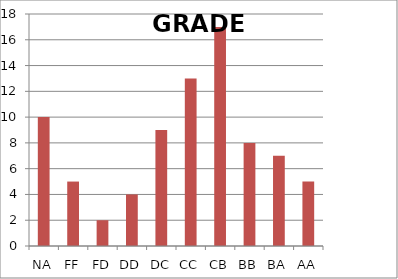
| Category | GRADE |
|---|---|
| NA | 10 |
| FF | 5 |
| FD | 2 |
| DD | 4 |
| DC | 9 |
| CC | 13 |
| CB | 17 |
| BB | 8 |
| BA | 7 |
| AA | 5 |